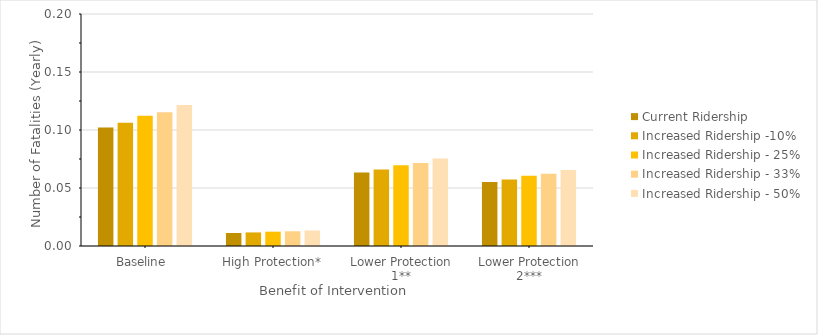
| Category | Current Ridership | Increased Ridership -10% | Increased Ridership - 25% | Increased Ridership - 33% | Increased Ridership - 50% |
|---|---|---|---|---|---|
| Baseline  | 0.102 | 0.106 | 0.112 | 0.115 | 0.122 |
| High Protection* | 0.011 | 0.012 | 0.012 | 0.013 | 0.013 |
| Lower Protection 1** | 0.063 | 0.066 | 0.07 | 0.072 | 0.075 |
| Lower Protection 2*** | 0.055 | 0.057 | 0.061 | 0.062 | 0.066 |